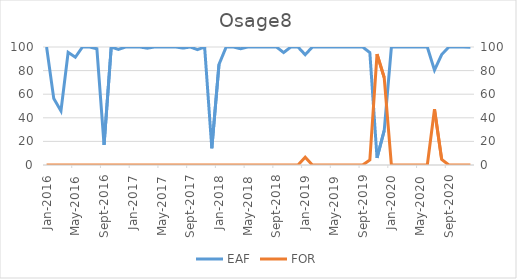
| Category | EAF |
|---|---|
| 2016-01-01 | 100 |
| 2016-02-01 | 56.25 |
| 2016-03-01 | 45.76 |
| 2016-04-01 | 95.44 |
| 2016-05-01 | 91.29 |
| 2016-06-01 | 100 |
| 2016-07-01 | 100 |
| 2016-08-01 | 98.52 |
| 2016-09-01 | 17 |
| 2016-10-01 | 100 |
| 2016-11-01 | 97.97 |
| 2016-12-01 | 100 |
| 2017-01-01 | 100 |
| 2017-02-01 | 100 |
| 2017-03-01 | 98.99 |
| 2017-04-01 | 100 |
| 2017-05-01 | 100 |
| 2017-06-01 | 100 |
| 2017-07-01 | 100 |
| 2017-08-01 | 99.06 |
| 2017-09-01 | 100 |
| 2017-10-01 | 97.78 |
| 2017-11-01 | 100 |
| 2017-12-01 | 14.19 |
| 2018-01-01 | 85.24 |
| 2018-02-01 | 100 |
| 2018-03-01 | 100 |
| 2018-04-01 | 98.53 |
| 2018-05-01 | 100 |
| 2018-06-01 | 100 |
| 2018-07-01 | 100 |
| 2018-08-01 | 100 |
| 2018-09-01 | 100 |
| 2018-10-01 | 95.3 |
| 2018-11-01 | 100 |
| 2018-12-01 | 100 |
| 2019-01-01 | 93.48 |
| 2019-02-01 | 100 |
| 2019-03-01 | 100 |
| 2019-04-01 | 100 |
| 2019-05-01 | 100 |
| 2019-06-01 | 100 |
| 2019-07-01 | 100 |
| 2019-08-01 | 100 |
| 2019-09-01 | 100 |
| 2019-10-01 | 95.26 |
| 2019-11-01 | 6.04 |
| 2019-12-01 | 29.23 |
| 2020-01-01 | 100 |
| 2020-02-01 | 100 |
| 2020-03-01 | 100 |
| 2020-04-01 | 100 |
| 2020-05-01 | 100 |
| 2020-06-01 | 100 |
| 2020-07-01 | 80.39 |
| 2020-08-01 | 93.6 |
| 2020-09-01 | 100 |
| 2020-10-01 | 100 |
| 2020-11-01 | 100 |
| 2020-12-01 | 99.76 |